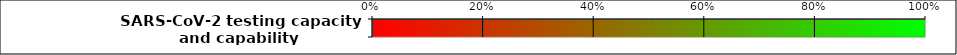
| Category | Series 7 |
|---|---|
| SARS-CoV-2 testing capacity and capability | 0 |